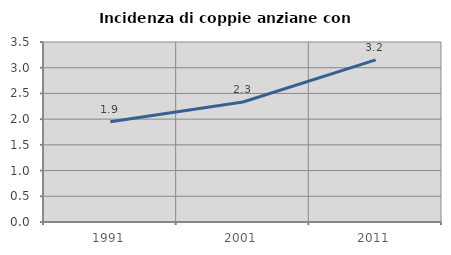
| Category | Incidenza di coppie anziane con figli |
|---|---|
| 1991.0 | 1.948 |
| 2001.0 | 2.332 |
| 2011.0 | 3.151 |